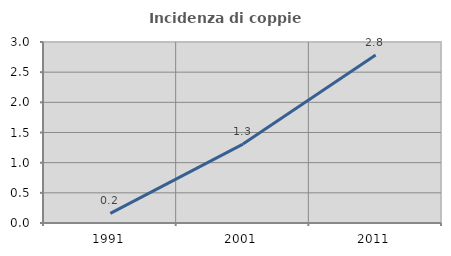
| Category | Incidenza di coppie miste |
|---|---|
| 1991.0 | 0.16 |
| 2001.0 | 1.308 |
| 2011.0 | 2.783 |